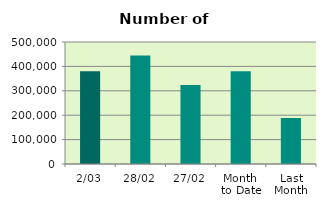
| Category | Series 0 |
|---|---|
| 2/03 | 380484 |
| 28/02 | 444812 |
| 27/02 | 323494 |
| Month 
to Date | 380484 |
| Last
Month | 188783.7 |